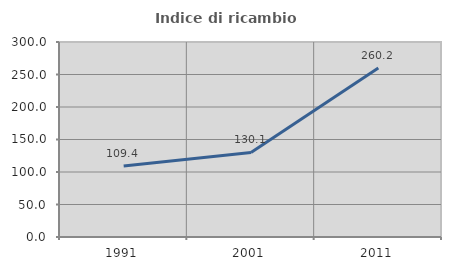
| Category | Indice di ricambio occupazionale  |
|---|---|
| 1991.0 | 109.392 |
| 2001.0 | 130.055 |
| 2011.0 | 260.163 |